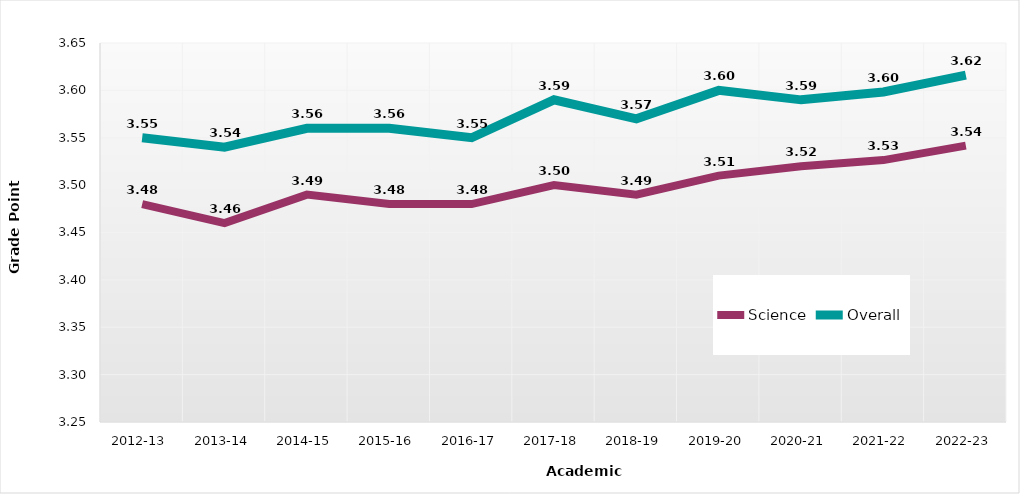
| Category | Science | Overall |
|---|---|---|
| 2012-13 | 3.48 | 3.55 |
| 2013-14 | 3.46 | 3.54 |
| 2014-15 | 3.49 | 3.56 |
| 2015-16 | 3.48 | 3.56 |
| 2016-17 | 3.48 | 3.55 |
| 2017-18 | 3.5 | 3.59 |
| 2018-19 | 3.49 | 3.57 |
| 2019-20 | 3.51 | 3.6 |
| 2020-21 | 3.52 | 3.59 |
| 2021-22 | 3.526 | 3.598 |
| 2022-23 | 3.542 | 3.616 |